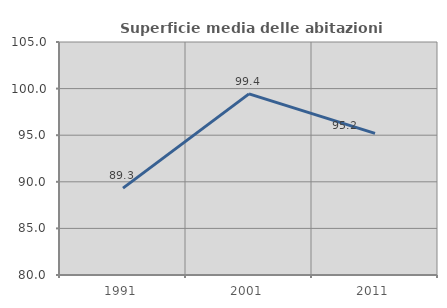
| Category | Superficie media delle abitazioni occupate |
|---|---|
| 1991.0 | 89.324 |
| 2001.0 | 99.433 |
| 2011.0 | 95.19 |